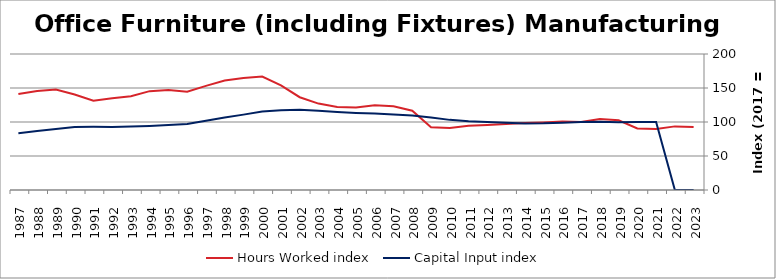
| Category | Hours Worked index | Capital Input index |
|---|---|---|
| 2023.0 | 92.758 | 0 |
| 2022.0 | 93.555 | 0 |
| 2021.0 | 89.769 | 99.877 |
| 2020.0 | 90.543 | 99.859 |
| 2019.0 | 102.434 | 99.658 |
| 2018.0 | 104.228 | 100.27 |
| 2017.0 | 100 | 100 |
| 2016.0 | 100.706 | 99.018 |
| 2015.0 | 99.287 | 97.993 |
| 2014.0 | 98.419 | 97.896 |
| 2013.0 | 97.133 | 99.036 |
| 2012.0 | 95.682 | 100.005 |
| 2011.0 | 94.583 | 101.166 |
| 2010.0 | 91.117 | 103.135 |
| 2009.0 | 92.251 | 106.682 |
| 2008.0 | 116.521 | 109.396 |
| 2007.0 | 123.006 | 111.146 |
| 2006.0 | 124.629 | 112.509 |
| 2005.0 | 121.218 | 113.366 |
| 2004.0 | 121.937 | 114.765 |
| 2003.0 | 127.083 | 116.687 |
| 2002.0 | 136.446 | 118.021 |
| 2001.0 | 153.803 | 117.36 |
| 2000.0 | 166.782 | 115.315 |
| 1999.0 | 164.717 | 110.845 |
| 1998.0 | 160.908 | 106.777 |
| 1997.0 | 153.131 | 101.903 |
| 1996.0 | 144.59 | 97.08 |
| 1995.0 | 146.88 | 95.713 |
| 1994.0 | 145.363 | 94.283 |
| 1993.0 | 137.909 | 93.321 |
| 1992.0 | 134.933 | 92.672 |
| 1991.0 | 131.291 | 92.918 |
| 1990.0 | 140.456 | 92.618 |
| 1989.0 | 147.881 | 89.817 |
| 1988.0 | 145.531 | 86.733 |
| 1987.0 | 141.204 | 83.608 |